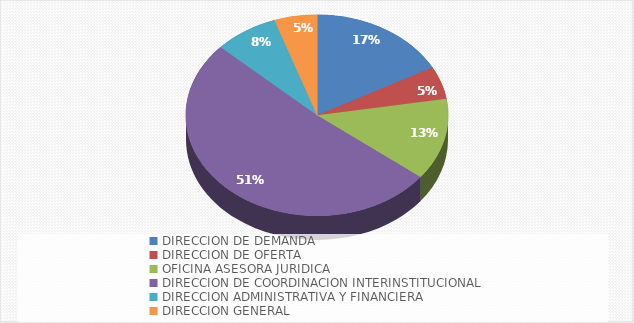
| Category | Cantidad de solicitudes |
|---|---|
| DIRECCION DE DEMANDA | 13 |
| DIRECCION DE OFERTA | 4 |
| OFICINA ASESORA JURIDICA | 10 |
| DIRECCION DE COORDINACION INTERINSTITUCIONAL | 39 |
| DIRECCION ADMINISTRATIVA Y FINANCIERA | 6 |
| DIRECCION GENERAL | 4 |